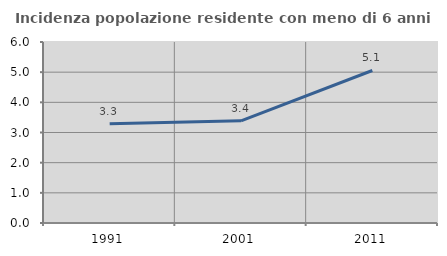
| Category | Incidenza popolazione residente con meno di 6 anni |
|---|---|
| 1991.0 | 3.286 |
| 2001.0 | 3.387 |
| 2011.0 | 5.055 |